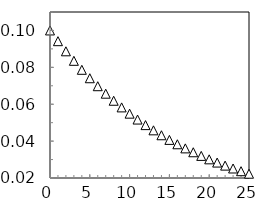
| Category | zero order |
|---|---|
| 0.0 | 0.1 |
| 1.0 | 0.094 |
| 2.0 | 0.089 |
| 3.0 | 0.084 |
| 4.0 | 0.079 |
| 5.0 | 0.074 |
| 6.0 | 0.07 |
| 7.0 | 0.066 |
| 8.0 | 0.062 |
| 9.0 | 0.058 |
| 10.0 | 0.055 |
| 11.0 | 0.052 |
| 12.0 | 0.049 |
| 13.0 | 0.046 |
| 14.0 | 0.043 |
| 15.0 | 0.041 |
| 16.0 | 0.038 |
| 17.0 | 0.036 |
| 18.0 | 0.034 |
| 19.0 | 0.032 |
| 20.0 | 0.03 |
| 21.0 | 0.028 |
| 22.0 | 0.027 |
| 23.0 | 0.025 |
| 24.0 | 0.024 |
| 25.0 | 0.022 |